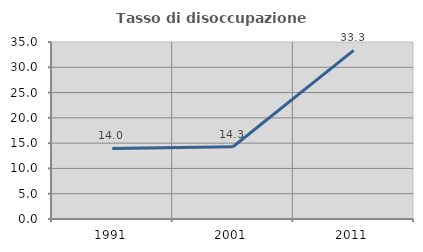
| Category | Tasso di disoccupazione giovanile  |
|---|---|
| 1991.0 | 13.953 |
| 2001.0 | 14.286 |
| 2011.0 | 33.333 |